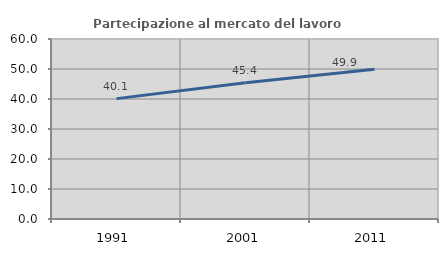
| Category | Partecipazione al mercato del lavoro  femminile |
|---|---|
| 1991.0 | 40.125 |
| 2001.0 | 45.42 |
| 2011.0 | 49.949 |